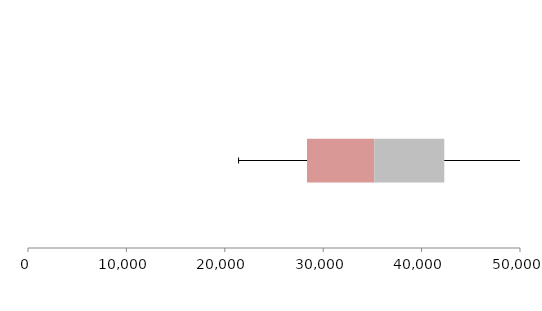
| Category | Series 1 | Series 2 | Series 3 |
|---|---|---|---|
| 0 | 28353.056 | 6833.363 | 7117.909 |